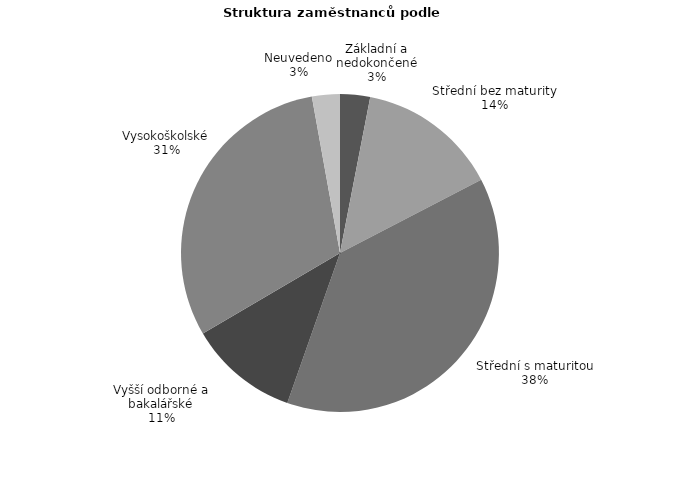
| Category | Series 0 |
|---|---|
| Základní a nedokončené | 19.546 |
| Střední bez maturity | 91.862 |
| Střední s maturitou | 243.425 |
| Vyšší odborné a bakalářské | 71.593 |
| Vysokoškolské | 196.143 |
| Neuvedeno | 18.175 |